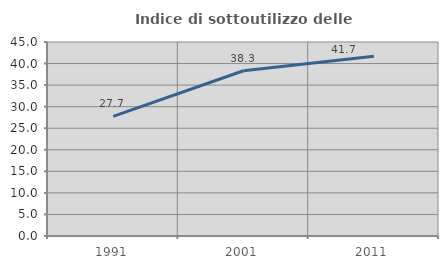
| Category | Indice di sottoutilizzo delle abitazioni  |
|---|---|
| 1991.0 | 27.729 |
| 2001.0 | 38.325 |
| 2011.0 | 41.686 |